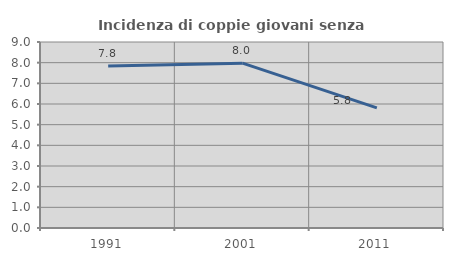
| Category | Incidenza di coppie giovani senza figli |
|---|---|
| 1991.0 | 7.843 |
| 2001.0 | 7.978 |
| 2011.0 | 5.81 |